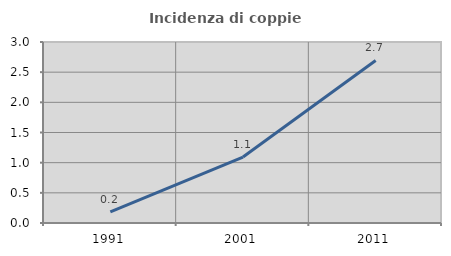
| Category | Incidenza di coppie miste |
|---|---|
| 1991.0 | 0.184 |
| 2001.0 | 1.093 |
| 2011.0 | 2.694 |